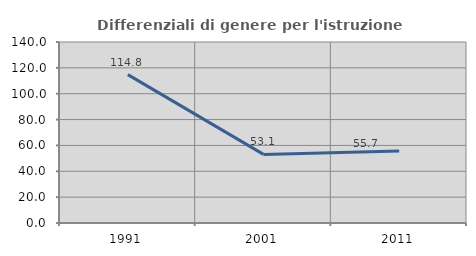
| Category | Differenziali di genere per l'istruzione superiore |
|---|---|
| 1991.0 | 114.783 |
| 2001.0 | 53.054 |
| 2011.0 | 55.745 |